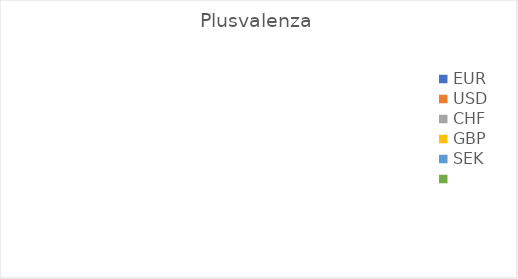
| Category | Plusvalenza |
|---|---|
| EUR | 0 |
| USD | 0 |
| CHF | 0 |
| GBP | 0 |
| SEK | 0 |